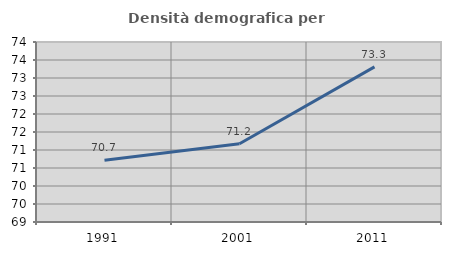
| Category | Densità demografica |
|---|---|
| 1991.0 | 70.713 |
| 2001.0 | 71.175 |
| 2011.0 | 73.309 |